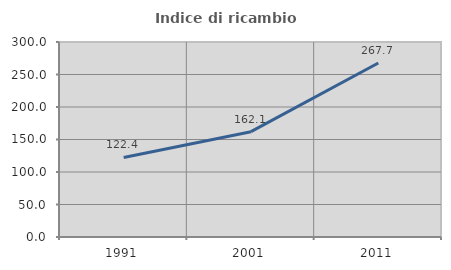
| Category | Indice di ricambio occupazionale  |
|---|---|
| 1991.0 | 122.374 |
| 2001.0 | 162.069 |
| 2011.0 | 267.717 |